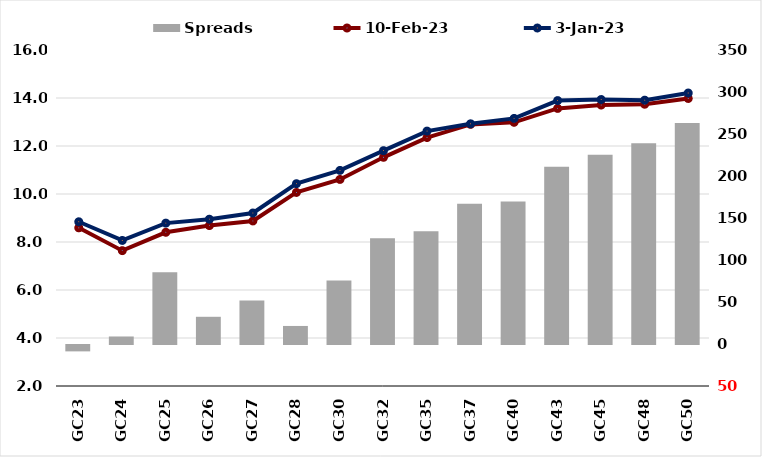
| Category |  Spreads   |
|---|---|
| GC23 | -7.588 |
| GC24 | 8.954 |
| GC25 | 85.382 |
| GC26 | 32.399 |
| GC27 | 51.665 |
| GC28 | 21.483 |
| GC30 | 75.69 |
| GC32 | 125.781 |
| GC35 | 134.18 |
| GC37 | 167.081 |
| GC40 | 169.677 |
| GC43 | 211.09 |
| GC45 | 225.151 |
| GC48 | 239.024 |
| GC50 | 262.992 |